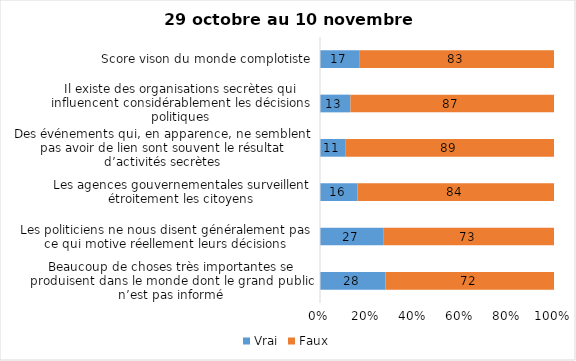
| Category | Vrai | Faux |
|---|---|---|
| Beaucoup de choses très importantes se produisent dans le monde dont le grand public n’est pas informé | 28 | 72 |
| Les politiciens ne nous disent généralement pas ce qui motive réellement leurs décisions | 27 | 73 |
| Les agences gouvernementales surveillent étroitement les citoyens | 16 | 84 |
| Des événements qui, en apparence, ne semblent pas avoir de lien sont souvent le résultat d’activités secrètes | 11 | 89 |
| Il existe des organisations secrètes qui influencent considérablement les décisions politiques | 13 | 87 |
| Score vison du monde complotiste | 17 | 83 |